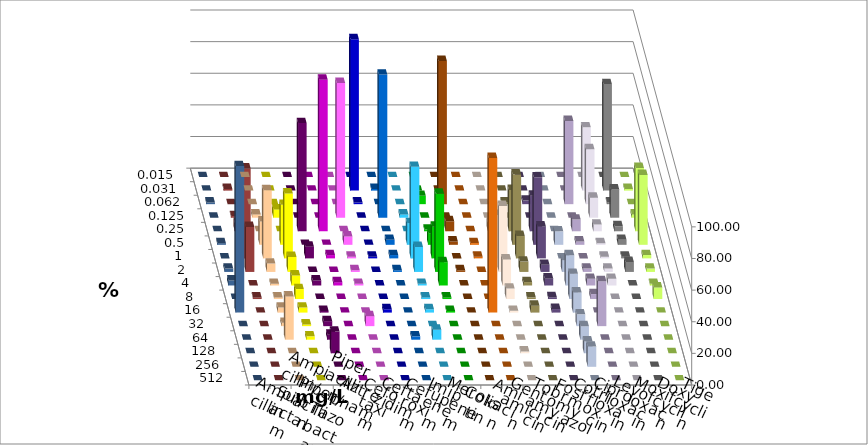
| Category | Ampicillin | Ampicillin/ Sulbactam | Piperacillin | Piperacillin/ Tazobactam | Aztreonam | Cefotaxim | Ceftazidim | Cefuroxim | Imipenem | Meropenem | Colistin | Amikacin | Gentamicin | Tobramycin | Fosfomycin | Cotrimoxazol | Ciprofloxacin | Levofloxacin | Moxifloxacin | Doxycyclin | Tigecyclin |
|---|---|---|---|---|---|---|---|---|---|---|---|---|---|---|---|---|---|---|---|---|---|
| 0.015 | 0 | 0 | 0 | 0 | 0 | 0 | 0 | 0 | 0 | 0 | 0 | 0 | 0 | 0 | 0 | 0 | 0 | 0 | 0 | 0 | 0 |
| 0.031 | 0 | 0 | 0 | 0 | 0 | 95.789 | 1.053 | 0 | 0 | 0 | 0 | 0 | 0 | 0 | 0 | 0 | 40 | 67.368 | 1.053 | 0 | 1.053 |
| 0.062 | 0 | 0 | 0 | 0 | 0 | 1.053 | 0 | 0 | 5.263 | 90.526 | 0 | 0 | 1.087 | 2.247 | 0 | 52.632 | 34.737 | 1.053 | 0 | 1.053 | 0 |
| 0.125 | 2.105 | 5.263 | 0 | 0 | 85.263 | 0 | 90.526 | 2.105 | 0 | 0 | 0 | 0 | 0 | 0 | 0 | 0 | 12.632 | 17.895 | 2.105 | 0 | 1.053 |
| 0.25 | 0 | 0 | 68.421 | 95.789 | 0 | 0 | 0 | 0 | 1.053 | 6.316 | 0 | 5.495 | 26.087 | 22.472 | 0 | 7.368 | 4.211 | 3.158 | 40 | 0 | 5.263 |
| 0.5 | 14.737 | 25.263 | 0 | 0 | 5.263 | 0 | 3.158 | 13.684 | 7.368 | 2.105 | 1.099 | 0 | 44.565 | 42.697 | 8.511 | 2.105 | 1.053 | 3.158 | 44.211 | 1.053 | 6.316 |
| 1.0 | 43.158 | 41.053 | 7.368 | 2.105 | 1.053 | 1.053 | 2.105 | 57.895 | 20 | 0 | 1.099 | 27.473 | 14.13 | 20.225 | 0 | 0 | 1.053 | 1.053 | 2.105 | 0 | 56.842 |
| 2.0 | 5.263 | 9.474 | 0 | 0 | 1.053 | 0 | 1.053 | 15.789 | 49.474 | 1.053 | 0 | 41.758 | 6.522 | 4.494 | 7.447 | 2.105 | 2.105 | 6.316 | 2.105 | 2.105 | 28.421 |
| 4.0 | 1.053 | 6.316 | 3.158 | 2.105 | 1.053 | 0 | 0 | 1.053 | 14.737 | 0 | 0 | 16.484 | 2.174 | 4.494 | 19.149 | 4.211 | 4.211 | 0 | 1.053 | 3.158 | 0 |
| 8.0 | 1.053 | 6.316 | 0 | 0 | 0 | 0 | 0 | 1.053 | 1.053 | 0 | 0 | 6.593 | 1.087 | 1.124 | 15.957 | 3.158 | 0 | 0 | 7.368 | 0 | 1.053 |
| 16.0 | 3.158 | 3.158 | 1.053 | 0 | 0 | 2.105 | 0 | 2.105 | 1.053 | 0 | 97.802 | 1.099 | 4.348 | 2.247 | 12.766 | 0 | 0 | 0 | 0 | 92.632 | 0 |
| 32.0 | 2.105 | 1.053 | 3.158 | 0 | 6.316 | 0 | 0 | 0 | 0 | 0 | 0 | 0 | 0 | 0 | 7.447 | 28.421 | 0 | 0 | 0 | 0 | 0 |
| 64.0 | 27.368 | 2.105 | 3.158 | 0 | 0 | 0 | 2.105 | 6.316 | 0 | 0 | 0 | 0 | 0 | 0 | 8.511 | 0 | 0 | 0 | 0 | 0 | 0 |
| 128.0 | 0 | 0 | 13.684 | 0 | 0 | 0 | 0 | 0 | 0 | 0 | 0 | 1.099 | 0 | 0 | 7.447 | 0 | 0 | 0 | 0 | 0 | 0 |
| 256.0 | 0 | 0 | 0 | 0 | 0 | 0 | 0 | 0 | 0 | 0 | 0 | 0 | 0 | 0 | 12.766 | 0 | 0 | 0 | 0 | 0 | 0 |
| 512.0 | 0 | 0 | 0 | 0 | 0 | 0 | 0 | 0 | 0 | 0 | 0 | 0 | 0 | 0 | 0 | 0 | 0 | 0 | 0 | 0 | 0 |